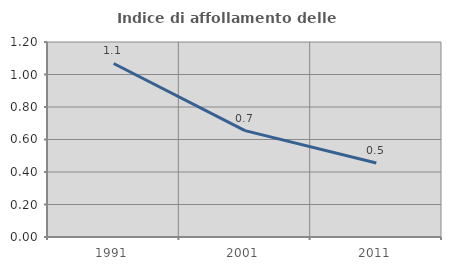
| Category | Indice di affollamento delle abitazioni  |
|---|---|
| 1991.0 | 1.068 |
| 2001.0 | 0.654 |
| 2011.0 | 0.455 |